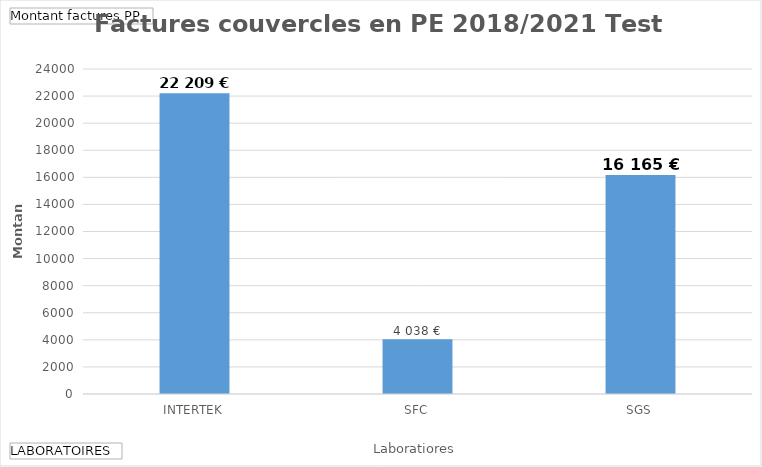
| Category | Total |
|---|---|
| INTERTEK | 22209 |
| SFC | 4038 |
| SGS | 16165 |